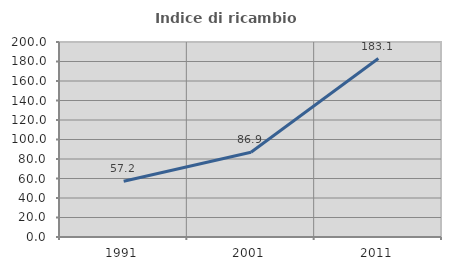
| Category | Indice di ricambio occupazionale  |
|---|---|
| 1991.0 | 57.237 |
| 2001.0 | 86.939 |
| 2011.0 | 183.069 |